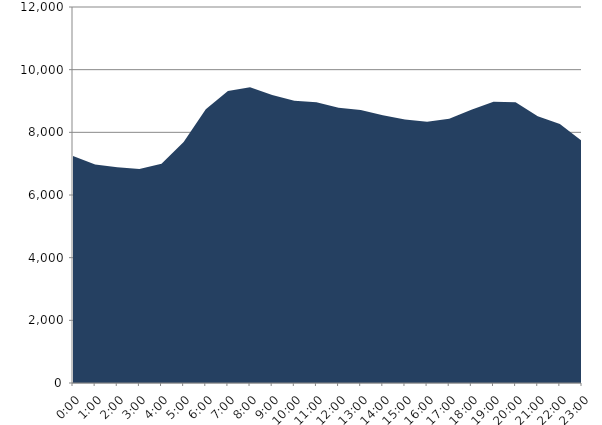
| Category | Series 0 | Series 1 |
|---|---|---|
| 2022-04-20 |  | 7248.248 |
| 2022-04-20 01:00:00 |  | 6977.24 |
| 2022-04-20 02:00:00 |  | 6888.906 |
| 2022-04-20 03:00:00 |  | 6826.192 |
| 2022-04-20 04:00:00 |  | 6994.229 |
| 2022-04-20 05:00:00 |  | 7688.629 |
| 2022-04-20 06:00:00 |  | 8733.77 |
| 2022-04-20 07:00:00 |  | 9315.842 |
| 2022-04-20 08:00:00 |  | 9439.865 |
| 2022-04-20 09:00:00 |  | 9188.368 |
| 2022-04-20 10:00:00 |  | 9006.007 |
| 2022-04-20 11:00:00 |  | 8957.282 |
| 2022-04-20 12:00:00 |  | 8781.723 |
| 2022-04-20 13:00:00 |  | 8711.859 |
| 2022-04-20 14:00:00 |  | 8544.803 |
| 2022-04-20 15:00:00 |  | 8408.052 |
| 2022-04-20 16:00:00 |  | 8341.232 |
| 2022-04-20 17:00:00 |  | 8434.13 |
| 2022-04-20 18:00:00 |  | 8719.921 |
| 2022-04-20 19:00:00 |  | 8979.457 |
| 2022-04-20 20:00:00 |  | 8962.735 |
| 2022-04-20 21:00:00 |  | 8510.502 |
| 2022-04-20 22:00:00 |  | 8263.547 |
| 2022-04-20 23:00:00 |  | 7726.289 |